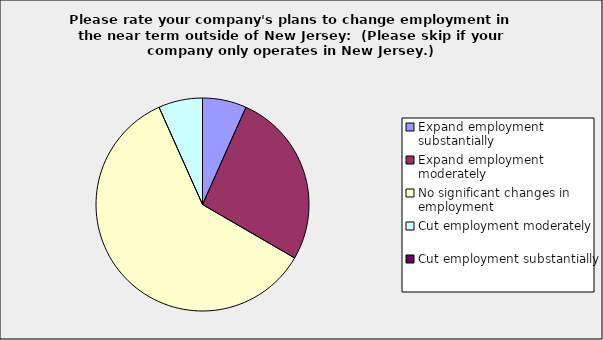
| Category | Series 0 |
|---|---|
| Expand employment substantially | 0.067 |
| Expand employment moderately | 0.267 |
| No significant changes in employment | 0.6 |
| Cut employment moderately | 0.067 |
| Cut employment substantially | 0 |